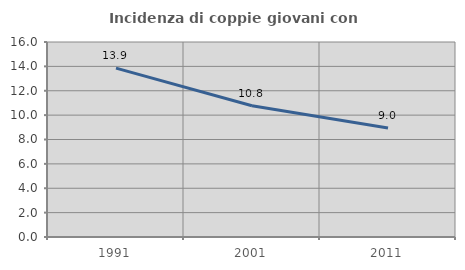
| Category | Incidenza di coppie giovani con figli |
|---|---|
| 1991.0 | 13.859 |
| 2001.0 | 10.769 |
| 2011.0 | 8.951 |